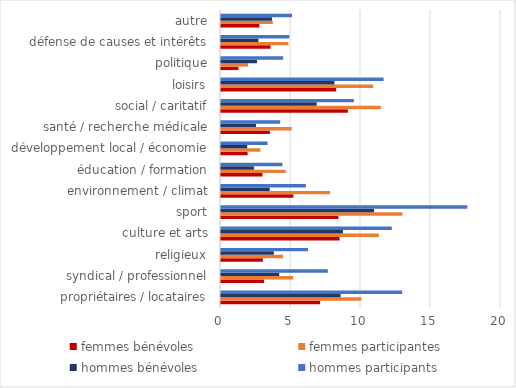
| Category | femmes bénévoles | femmes participantes | hommes bénévoles | hommes participants |
|---|---|---|---|---|
| propriétaires / locataires | 7.08 | 10.03 | 8.54 | 12.94 |
| syndical / professionnel | 3.07 | 5.15 | 4.16 | 7.63 |
| religieux | 2.99 | 4.44 | 3.77 | 6.21 |
| culture et arts | 8.47 | 11.28 | 8.71 | 12.2 |
| sport | 8.39 | 12.96 | 10.93 | 17.59 |
| environnement / climat | 5.17 | 7.79 | 3.48 | 6.06 |
| éducation / formation | 2.96 | 4.62 | 2.35 | 4.39 |
| développement local / économie | 1.9 | 2.81 | 1.87 | 3.33 |
| santé / recherche médicale | 3.49 | 5.05 | 2.5 | 4.23 |
| social / caritatif | 9.06 | 11.42 | 6.84 | 9.49 |
| loisirs | 8.23 | 10.87 | 8.1 | 11.61 |
| politique | 1.24 | 1.92 | 2.57 | 4.44 |
| défense de causes et intérêts | 3.54 | 4.82 | 2.67 | 4.88 |
| autre | 2.74 | 3.7 | 3.64 | 5.07 |